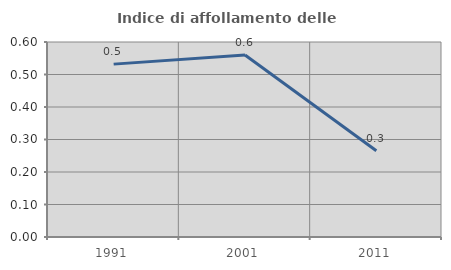
| Category | Indice di affollamento delle abitazioni  |
|---|---|
| 1991.0 | 0.532 |
| 2001.0 | 0.56 |
| 2011.0 | 0.265 |